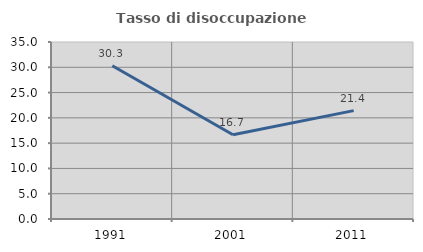
| Category | Tasso di disoccupazione giovanile  |
|---|---|
| 1991.0 | 30.303 |
| 2001.0 | 16.667 |
| 2011.0 | 21.429 |